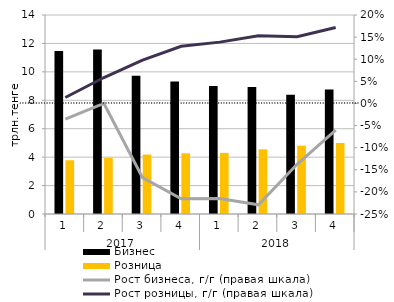
| Category | Бизнес | Розница |
|---|---|---|
| 0 | 11.47 | 3.78 |
| 1 | 11.58 | 3.95 |
| 2 | 9.73 | 4.18 |
| 3 | 9.32 | 4.27 |
| 4 | 9.01 | 4.3 |
| 5 | 8.93 | 4.55 |
| 6 | 8.39 | 4.81 |
| 7 | 8.76 | 5 |